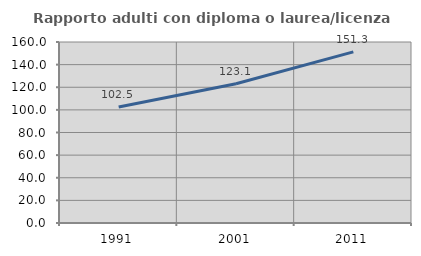
| Category | Rapporto adulti con diploma o laurea/licenza media  |
|---|---|
| 1991.0 | 102.532 |
| 2001.0 | 123.099 |
| 2011.0 | 151.269 |